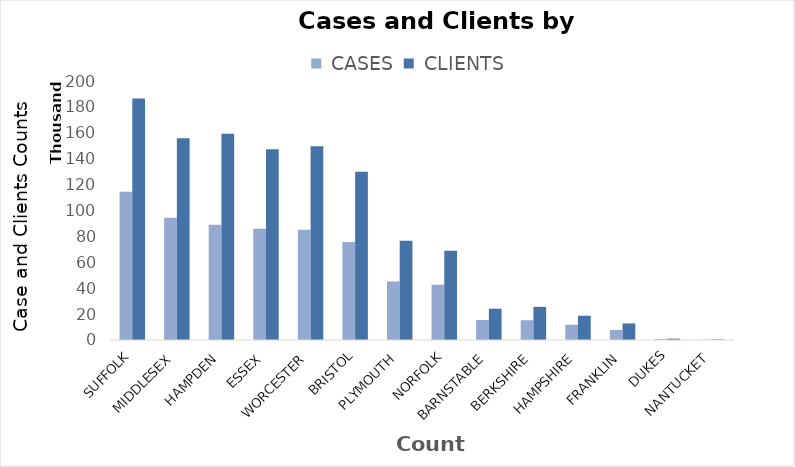
| Category |  CASES |  CLIENTS |
|---|---|---|
| SUFFOLK | 114431 | 186569 |
| MIDDLESEX | 94462 | 155766 |
| HAMPDEN | 89020 | 159338 |
| ESSEX | 85907 | 147218 |
| WORCESTER | 85067 | 149523 |
| BRISTOL | 75755 | 129844 |
| PLYMOUTH | 45216 | 76624 |
| NORFOLK | 42682 | 68934 |
| BARNSTABLE | 15430 | 24162 |
| BERKSHIRE | 15276 | 25608 |
| HAMPSHIRE | 11821 | 18745 |
| FRANKLIN | 7756 | 12766 |
| DUKES | 708 | 1042 |
| NANTUCKET | 228 | 412 |